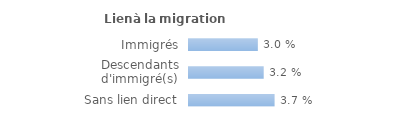
| Category | Series 0 |
|---|---|
| Immigrés | 0.03 |
| Descendants d'immigré(s) | 0.032 |
| Sans lien direct | 0.037 |